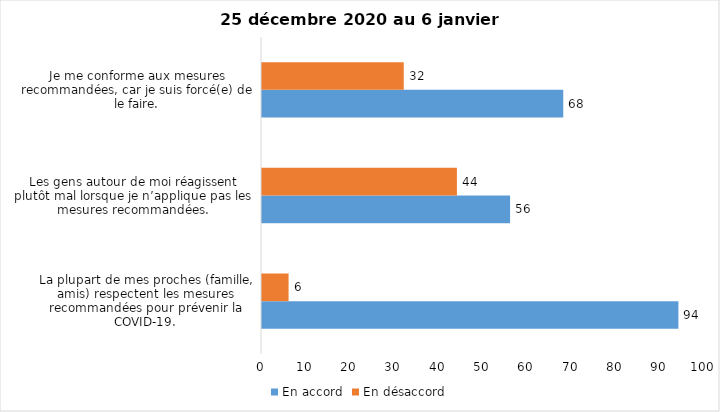
| Category | En accord | En désaccord |
|---|---|---|
| La plupart de mes proches (famille, amis) respectent les mesures recommandées pour prévenir la COVID-19. | 94 | 6 |
| Les gens autour de moi réagissent plutôt mal lorsque je n’applique pas les mesures recommandées. | 56 | 44 |
| Je me conforme aux mesures recommandées, car je suis forcé(e) de le faire. | 68 | 32 |